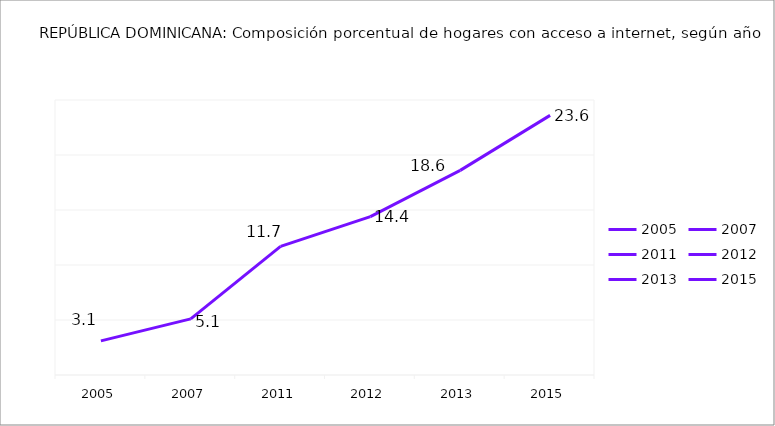
| Category |    Porcentaje de hogares |
|---|---|
| 2005.0 | 3.1 |
| 2007.0 | 5.1 |
| 2011.0 | 11.7 |
| 2012.0 | 14.4 |
| 2013.0 | 18.6 |
| 2015.0 | 23.6 |